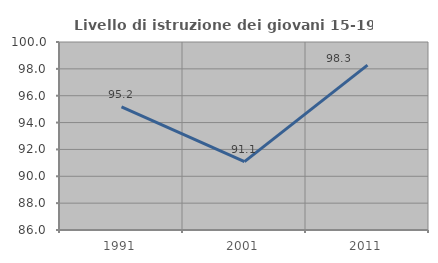
| Category | Livello di istruzione dei giovani 15-19 anni |
|---|---|
| 1991.0 | 95.161 |
| 2001.0 | 91.096 |
| 2011.0 | 98.276 |